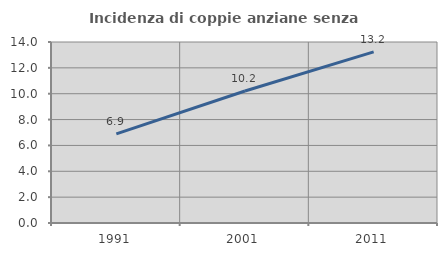
| Category | Incidenza di coppie anziane senza figli  |
|---|---|
| 1991.0 | 6.899 |
| 2001.0 | 10.212 |
| 2011.0 | 13.233 |